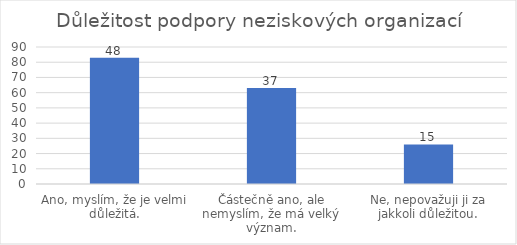
| Category | Počet respondentů |
|---|---|
| Ano, myslím, že je velmi důležitá. | 83 |
| Částečně ano, ale nemyslím, že má velký význam. | 63 |
| Ne, nepovažuji ji za jakkoli důležitou. | 26 |